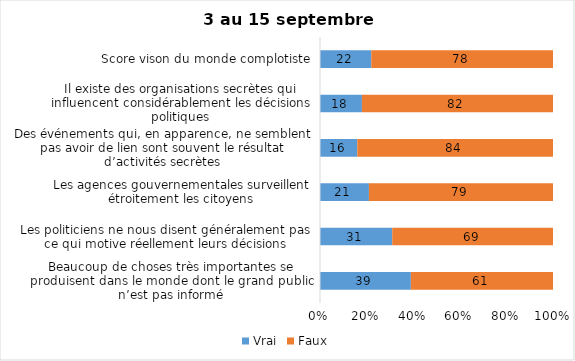
| Category | Vrai | Faux |
|---|---|---|
| Beaucoup de choses très importantes se produisent dans le monde dont le grand public n’est pas informé | 39 | 61 |
| Les politiciens ne nous disent généralement pas ce qui motive réellement leurs décisions | 31 | 69 |
| Les agences gouvernementales surveillent étroitement les citoyens | 21 | 79 |
| Des événements qui, en apparence, ne semblent pas avoir de lien sont souvent le résultat d’activités secrètes | 16 | 84 |
| Il existe des organisations secrètes qui influencent considérablement les décisions politiques | 18 | 82 |
| Score vison du monde complotiste | 22 | 78 |